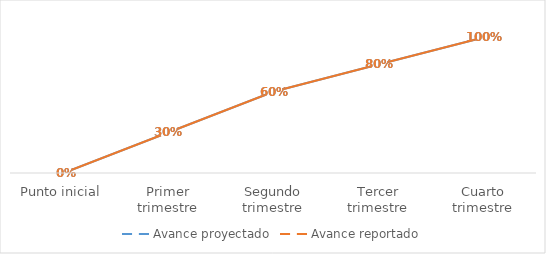
| Category | Avance proyectado | Avance reportado |
|---|---|---|
| Punto inicial | 0 | 0 |
| Primer trimestre | 0.3 | 0.3 |
| Segundo trimestre | 0.6 | 0.6 |
| Tercer trimestre | 0.8 | 0.8 |
| Cuarto trimestre | 1 | 1 |